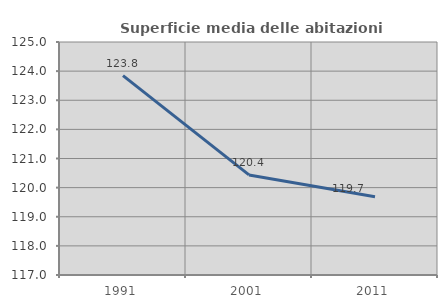
| Category | Superficie media delle abitazioni occupate |
|---|---|
| 1991.0 | 123.844 |
| 2001.0 | 120.437 |
| 2011.0 | 119.683 |